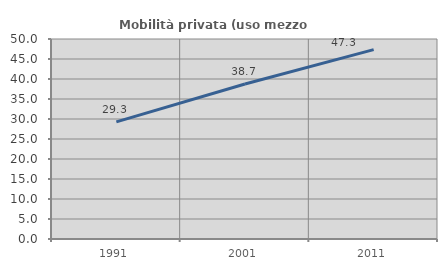
| Category | Mobilità privata (uso mezzo privato) |
|---|---|
| 1991.0 | 29.289 |
| 2001.0 | 38.74 |
| 2011.0 | 47.347 |